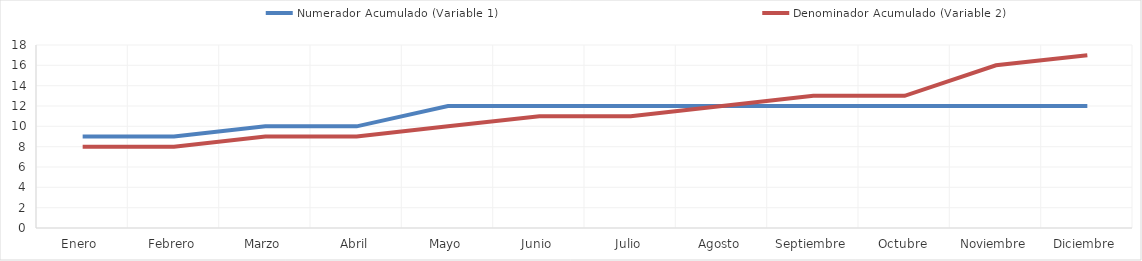
| Category | Numerador Acumulado (Variable 1) | Denominador Acumulado (Variable 2) |
|---|---|---|
| Enero  | 9 | 8 |
| Febrero | 9 | 8 |
| Marzo | 10 | 9 |
| Abril | 10 | 9 |
| Mayo | 12 | 10 |
| Junio | 12 | 11 |
| Julio | 12 | 11 |
| Agosto | 12 | 12 |
| Septiembre | 12 | 13 |
| Octubre | 12 | 13 |
| Noviembre | 12 | 16 |
| Diciembre | 12 | 17 |